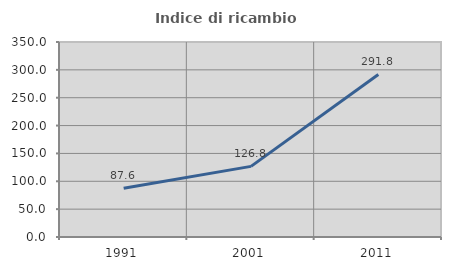
| Category | Indice di ricambio occupazionale  |
|---|---|
| 1991.0 | 87.571 |
| 2001.0 | 126.776 |
| 2011.0 | 291.803 |